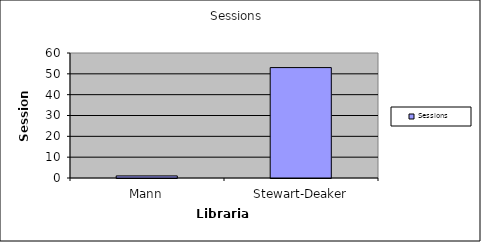
| Category | Sessions |
|---|---|
| Mann | 1 |
| Stewart-Deaker | 53 |